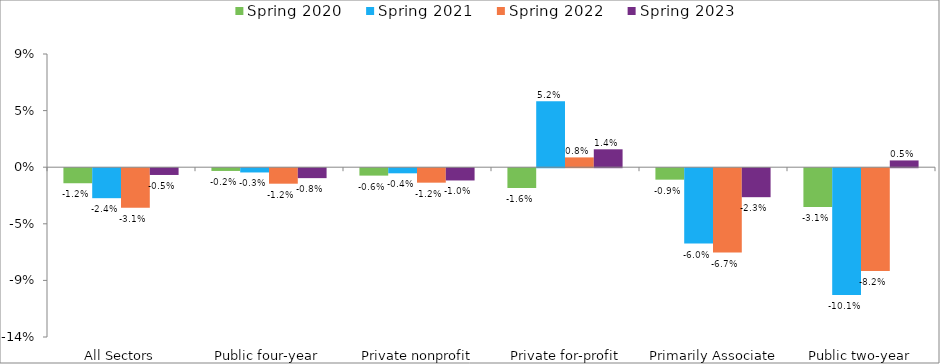
| Category | Spring 2020 | Spring 2021 | Spring 2022 | Spring 2023 |
|---|---|---|---|---|
| All Sectors | -0.012 | -0.024 | -0.031 | -0.005 |
| Public four-year | -0.002 | -0.003 | -0.012 | -0.008 |
| Private nonprofit four-year | -0.006 | -0.004 | -0.012 | -0.01 |
| Private for-profit four-year | -0.016 | 0.052 | 0.008 | 0.014 |
| Primarily Associate Degree Granting Baccalaureate Institutions (PABs) | -0.009 | -0.06 | -0.067 | -0.023 |
| Public two-year | -0.031 | -0.101 | -0.082 | 0.005 |